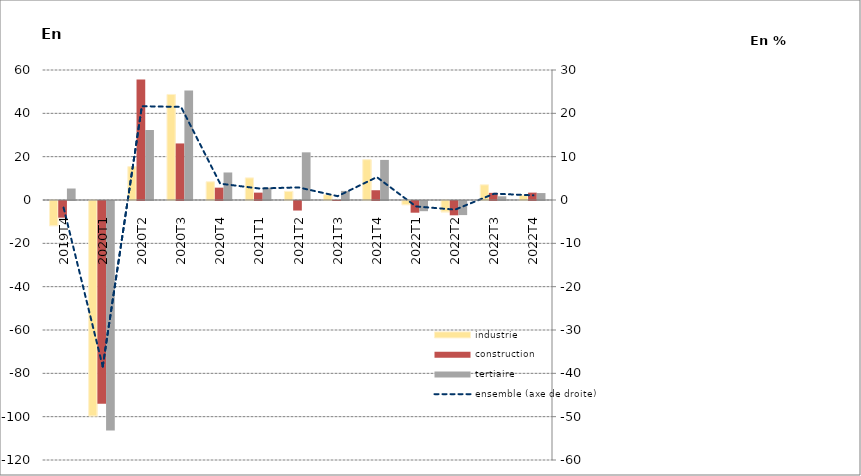
| Category | industrie | construction | tertiaire |
|---|---|---|---|
| 2019T4 | -11.6 | -7.7 | 5.3 |
| 2020T1 | -99.4 | -93.6 | -105.9 |
| 2020T2 | 15.4 | 55.6 | 32.3 |
| 2020T3 | 48.7 | 26.1 | 50.5 |
| 2020T4 | 8.4 | 5.7 | 12.7 |
| 2021T1 | 10.2 | 3.4 | 5.7 |
| 2021T2 | 4 | -4.4 | 22 |
| 2021T3 | 2.4 | 0.1 | 4.2 |
| 2021T4 | 18.6 | 4.5 | 18.5 |
| 2022T1 | -1.9 | -5.4 | -4.7 |
| 2022T2 | -5.2 | -6.6 | -6.5 |
| 2022T3 | 7 | 3.3 | 1.7 |
| 2022T4 | 2.2 | 3.4 | 3.2 |